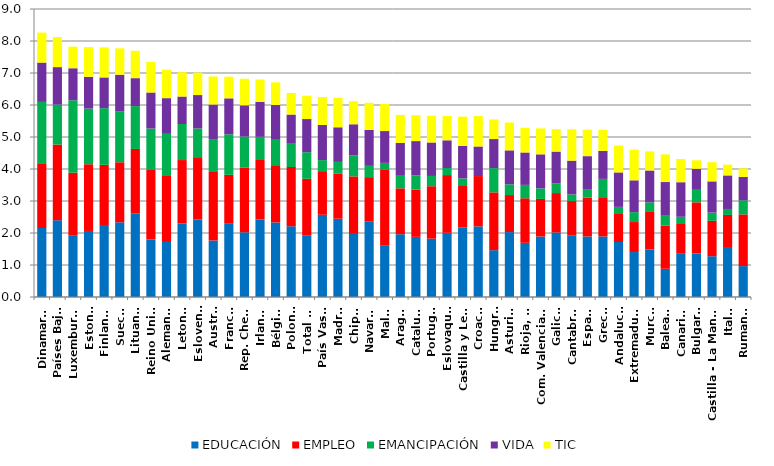
| Category | EDUCACIÓN | EMPLEO | EMANCIPACIÓN | VIDA | TIC |
|---|---|---|---|---|---|
| Dinamarca | 2.156 | 2.025 | 1.916 | 1.229 | 0.938 |
| Países Bajos | 2.399 | 2.366 | 1.247 | 1.172 | 0.941 |
| Luxemburgo | 1.932 | 1.954 | 2.264 | 1 | 0.675 |
| Estonia | 2.064 | 2.084 | 1.74 | 0.992 | 0.93 |
| Finlandia | 2.25 | 1.88 | 1.77 | 0.961 | 0.941 |
| Suecia | 2.335 | 1.876 | 1.594 | 1.142 | 0.824 |
| Lituania | 2.604 | 2.022 | 1.34 | 0.873 | 0.856 |
| Reino Unido | 1.797 | 2.173 | 1.295 | 1.125 | 0.959 |
| Alemania | 1.72 | 2.086 | 1.293 | 1.115 | 0.89 |
| Letonia | 2.295 | 1.985 | 1.127 | 0.858 | 0.759 |
| Eslovenia | 2.419 | 1.95 | 0.898 | 1.044 | 0.701 |
| Austria | 1.767 | 2.164 | 1.005 | 1.079 | 0.877 |
| Francia | 2.288 | 1.53 | 1.265 | 1.126 | 0.676 |
| Rep. Checa | 2.022 | 2.027 | 0.967 | 0.975 | 0.83 |
| Irlanda | 2.422 | 1.859 | 0.724 | 1.093 | 0.698 |
| Bélgica | 2.33 | 1.789 | 0.793 | 1.09 | 0.706 |
| Polonia | 2.211 | 1.852 | 0.726 | 0.913 | 0.673 |
| Total UE | 1.915 | 1.78 | 0.831 | 1.037 | 0.729 |
| País Vasco | 2.57 | 1.363 | 0.345 | 1.097 | 0.873 |
| Madrid | 2.447 | 1.416 | 0.36 | 1.082 | 0.922 |
| Chipre | 1.971 | 1.798 | 0.652 | 0.976 | 0.72 |
| Navarra | 2.354 | 1.392 | 0.353 | 1.123 | 0.848 |
| Malta | 1.601 | 2.386 | 0.204 | 0.995 | 0.844 |
| Aragón | 1.962 | 1.435 | 0.391 | 1.026 | 0.876 |
| Cataluña | 1.879 | 1.474 | 0.445 | 1.074 | 0.811 |
| Portugal | 1.823 | 1.639 | 0.321 | 1.046 | 0.839 |
| Eslovaquia | 2.007 | 1.803 | 0.222 | 0.865 | 0.762 |
| Castilla y León | 2.17 | 1.299 | 0.238 | 1.015 | 0.917 |
| Croacia | 2.207 | 1.573 | -0.024 | 0.924 | 0.95 |
| Hungría | 1.464 | 1.805 | 0.758 | 0.909 | 0.614 |
| Asturias | 2.029 | 1.157 | 0.336 | 1.061 | 0.87 |
| Rioja, La | 1.693 | 1.392 | 0.418 | 1.013 | 0.773 |
| Com. Valenciana | 1.891 | 1.175 | 0.329 | 1.064 | 0.81 |
| Galicia | 2.017 | 1.232 | 0.307 | 0.99 | 0.7 |
| Cantabria | 1.93 | 1.069 | 0.208 | 1.055 | 0.98 |
| España | 1.893 | 1.211 | 0.25 | 1.049 | 0.827 |
| Grecia | 1.892 | 1.226 | 0.573 | 0.876 | 0.66 |
| Andalucía | 1.719 | 0.874 | 0.223 | 1.077 | 0.841 |
| Extremadura | 1.405 | 0.937 | 0.31 | 0.994 | 0.961 |
| Murcia | 1.484 | 1.195 | 0.278 | 0.997 | 0.598 |
| Balears | 0.881 | 1.347 | 0.31 | 1.054 | 0.864 |
| Canarias | 1.351 | 0.931 | 0.226 | 1.08 | 0.725 |
| Bulgaria | 1.359 | 1.599 | 0.391 | 0.659 | 0.265 |
| Castilla - La Mancha | 1.275 | 1.105 | 0.259 | 0.975 | 0.599 |
| Italia | 1.562 | 1.002 | 0.187 | 1.049 | 0.338 |
| Rumania | 0.966 | 1.616 | 0.439 | 0.732 | 0.267 |